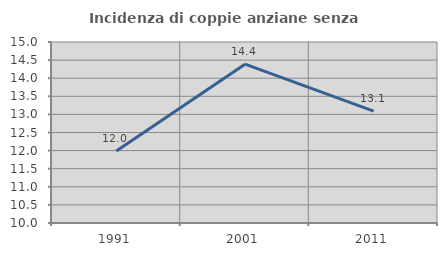
| Category | Incidenza di coppie anziane senza figli  |
|---|---|
| 1991.0 | 11.991 |
| 2001.0 | 14.388 |
| 2011.0 | 13.092 |